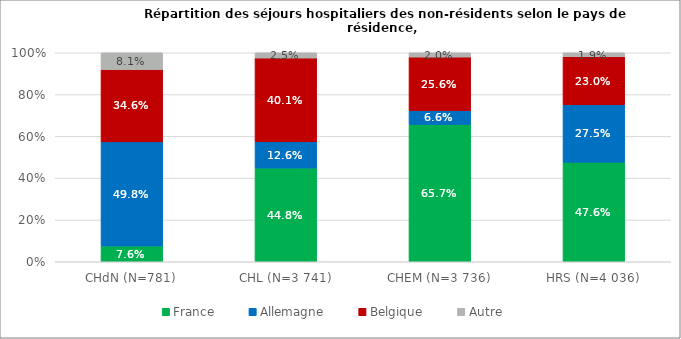
| Category | France | Allemagne | Belgique | Autre |
|---|---|---|---|---|
| CHdN (N=781) | 0.076 | 0.498 | 0.346 | 0.081 |
| CHL (N=3 741) | 0.448 | 0.126 | 0.401 | 0.025 |
| CHEM (N=3 736) | 0.657 | 0.066 | 0.256 | 0.02 |
| HRS (N=4 036) | 0.476 | 0.275 | 0.23 | 0.019 |